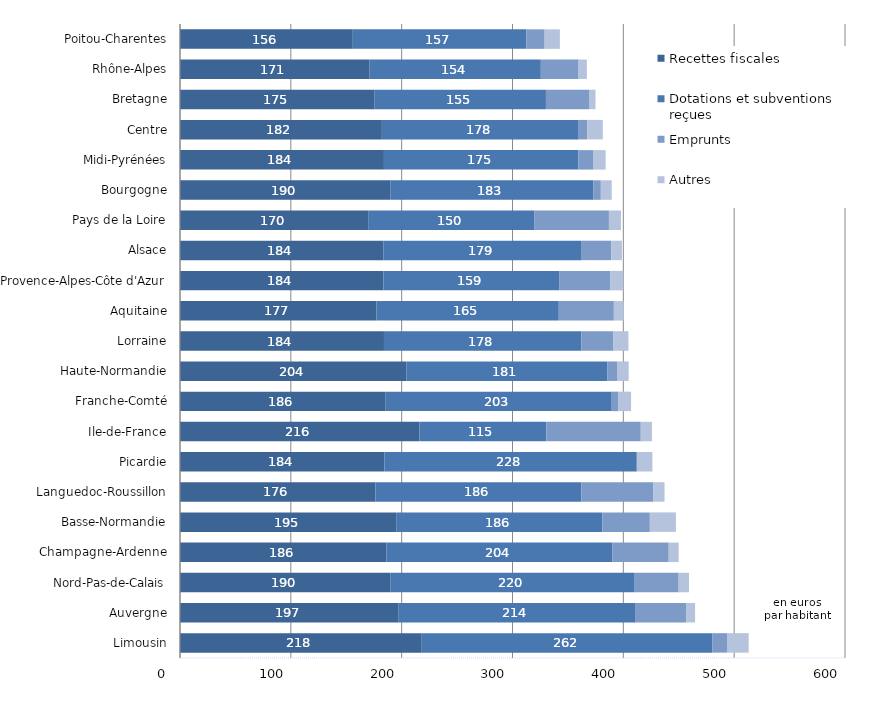
| Category | Recettes fiscales | Dotations et subventions reçues | Emprunts | Autres |
|---|---|---|---|---|
| Limousin | 218.126 | 262.357 | 13.073 | 19.54 |
| Auvergne | 196.863 | 214.301 | 45.81 | 7.759 |
| Nord-Pas-de-Calais | 189.675 | 219.969 | 40.271 | 9.316 |
| Champagne-Ardenne | 186.345 | 203.655 | 50.949 | 9 |
| Basse-Normandie | 195.064 | 186.037 | 42.817 | 23.53 |
| Languedoc-Roussillon | 176.349 | 185.865 | 64.977 | 9.978 |
| Picardie | 184.449 | 227.723 | 0 | 14.053 |
| Ile-de-France | 215.943 | 114.542 | 85.253 | 10.062 |
| Franche-Comté | 185.583 | 203.308 | 6.782 | 11.281 |
| Haute-Normandie | 204.135 | 181.302 | 8.87 | 10.503 |
| Lorraine | 184.034 | 178.026 | 29.088 | 13.481 |
| Aquitaine | 177.212 | 164.556 | 49.683 | 8.923 |
| Provence-Alpes-Côte d'Azur | 183.546 | 158.515 | 46.348 | 11.629 |
| Alsace | 183.669 | 178.774 | 26.584 | 9.709 |
| Pays de la Loire | 170.272 | 149.656 | 67.077 | 10.879 |
| Bourgogne | 189.675 | 183.128 | 6.891 | 9.822 |
| Midi-Pyrénées | 184 | 175.307 | 13.311 | 11.396 |
| Centre | 182.133 | 177.607 | 7.635 | 14.082 |
| Bretagne | 175.235 | 154.944 | 39.372 | 5.315 |
| Rhône-Alpes | 171.107 | 154.464 | 34.034 | 7.491 |
| Poitou-Charentes | 155.901 | 156.673 | 16.445 | 13.735 |